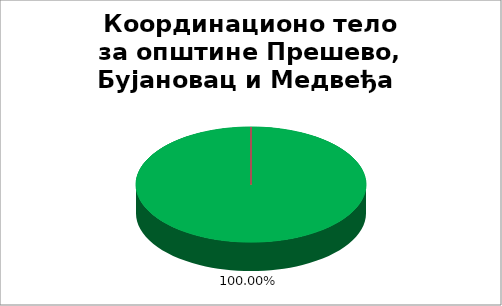
| Category | Координационо тело за општине Прешево, Бујановац и Медвеђа  |
|---|---|
| 0 | 1 |
| 1 | 0 |
| 2 | 0 |
| 3 | 0 |
| 4 | 0 |